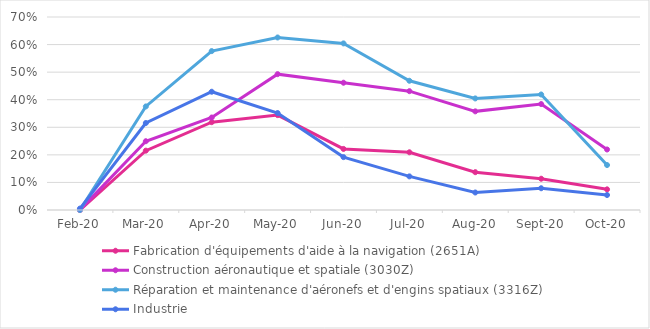
| Category | Fabrication d'équipements d'aide à la navigation (2651A) | Construction aéronautique et spatiale (3030Z) | Réparation et maintenance d'aéronefs et d'engins spatiaux (3316Z) | Industrie |
|---|---|---|---|---|
| 2020-02-01 | 0 | 0 | 0 | 0.005 |
| 2020-03-01 | 0.215 | 0.249 | 0.376 | 0.315 |
| 2020-04-01 | 0.319 | 0.335 | 0.576 | 0.429 |
| 2020-05-01 | 0.344 | 0.493 | 0.626 | 0.352 |
| 2020-06-01 | 0.222 | 0.462 | 0.604 | 0.192 |
| 2020-07-01 | 0.209 | 0.431 | 0.469 | 0.122 |
| 2020-08-01 | 0.137 | 0.358 | 0.405 | 0.063 |
| 2020-09-01 | 0.113 | 0.384 | 0.419 | 0.079 |
| 2020-10-01 | 0.075 | 0.219 | 0.163 | 0.054 |